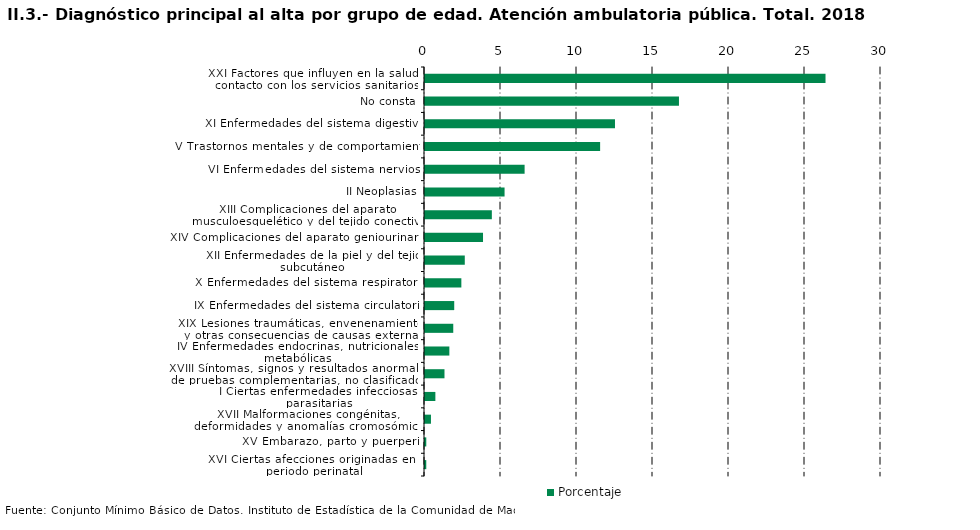
| Category | Porcentaje |
|---|---|
| XXI Factores que influyen en la salud y contacto con los servicios sanitarios | 26.35 |
| No consta | 16.708 |
| XI Enfermedades del sistema digestivo | 12.499 |
| V Trastornos mentales y de comportamiento | 11.522 |
| VI Enfermedades del sistema nervioso | 6.553 |
| II Neoplasias | 5.235 |
| XIII Complicaciones del aparato musculoesquelético y del tejido conectivo | 4.398 |
| XIV Complicaciones del aparato geniourinario | 3.817 |
| XII Enfermedades de la piel y del tejido subcutáneo | 2.617 |
| X Enfermedades del sistema respiratorio | 2.392 |
| IX Enfermedades del sistema circulatorio | 1.923 |
| XIX Lesiones traumáticas, envenenamientos y otras consecuencias de causas externas | 1.859 |
| IV Enfermedades endocrinas, nutricionales y metabólicas | 1.602 |
| XVIII Síntomas, signos y resultados anormales de pruebas complementarias, no clasificados bajo otro concepto | 1.282 |
| I Ciertas enfermedades infecciosas y parasitarias | 0.682 |
| XVII Malformaciones congénitas, deformidades y anomalías cromosómicas | 0.392 |
| XV Embarazo, parto y puerperio | 0.084 |
| XVI Ciertas afecciones originadas en el periodo perinatal | 0.084 |